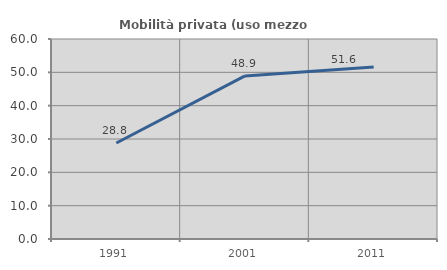
| Category | Mobilità privata (uso mezzo privato) |
|---|---|
| 1991.0 | 28.804 |
| 2001.0 | 48.921 |
| 2011.0 | 51.613 |